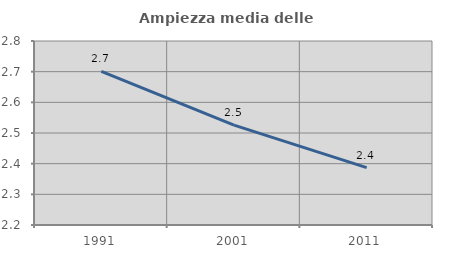
| Category | Ampiezza media delle famiglie |
|---|---|
| 1991.0 | 2.701 |
| 2001.0 | 2.526 |
| 2011.0 | 2.387 |